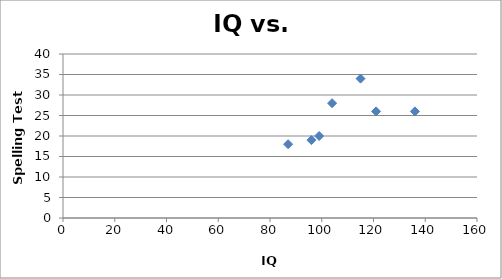
| Category | Spelling |
|---|---|
| 115.0 | 34 |
| 87.0 | 18 |
| 104.0 | 28 |
| 121.0 | 26 |
| 96.0 | 19 |
| 99.0 | 20 |
| 136.0 | 26 |